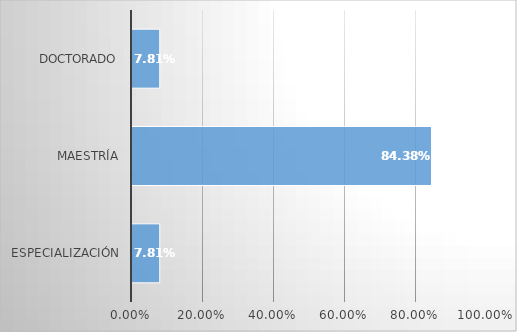
| Category | Series 0 |
|---|---|
| Especialización | 0.078 |
| Maestría | 0.844 |
| Doctorado | 0.078 |